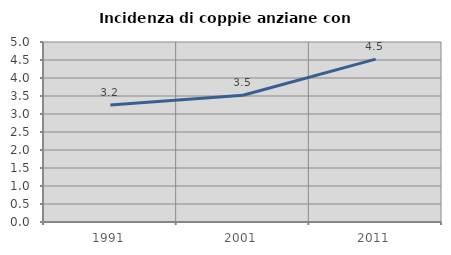
| Category | Incidenza di coppie anziane con figli |
|---|---|
| 1991.0 | 3.247 |
| 2001.0 | 3.52 |
| 2011.0 | 4.524 |